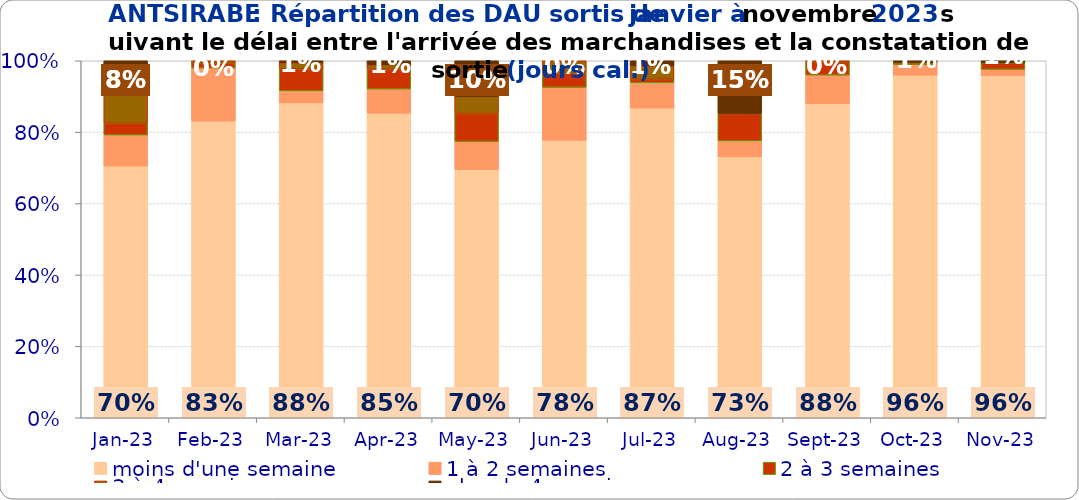
| Category | moins d'une semaine | 1 à 2 semaines | 2 à 3 semaines | 3 à 4 semaines | plus de 4 semaines |
|---|---|---|---|---|---|
| 2023-01-01 | 0.705 | 0.087 | 0.033 | 0.093 | 0.082 |
| 2023-02-01 | 0.831 | 0.149 | 0.014 | 0.007 | 0 |
| 2023-03-01 | 0.882 | 0.034 | 0.062 | 0.017 | 0.006 |
| 2023-04-01 | 0.853 | 0.068 | 0.056 | 0.011 | 0.011 |
| 2023-05-01 | 0.696 | 0.078 | 0.078 | 0.048 | 0.1 |
| 2023-06-01 | 0.777 | 0.149 | 0.04 | 0.035 | 0 |
| 2023-07-01 | 0.867 | 0.071 | 0.009 | 0.038 | 0.014 |
| 2023-08-01 | 0.731 | 0.045 | 0.077 | 0 | 0.147 |
| 2023-09-01 | 0.88 | 0.08 | 0.036 | 0.004 | 0 |
| 2023-10-01 | 0.959 | 0.031 | 0.005 | 0 | 0.005 |
| 2023-11-01 | 0.958 | 0.018 | 0.018 | 0 | 0.006 |